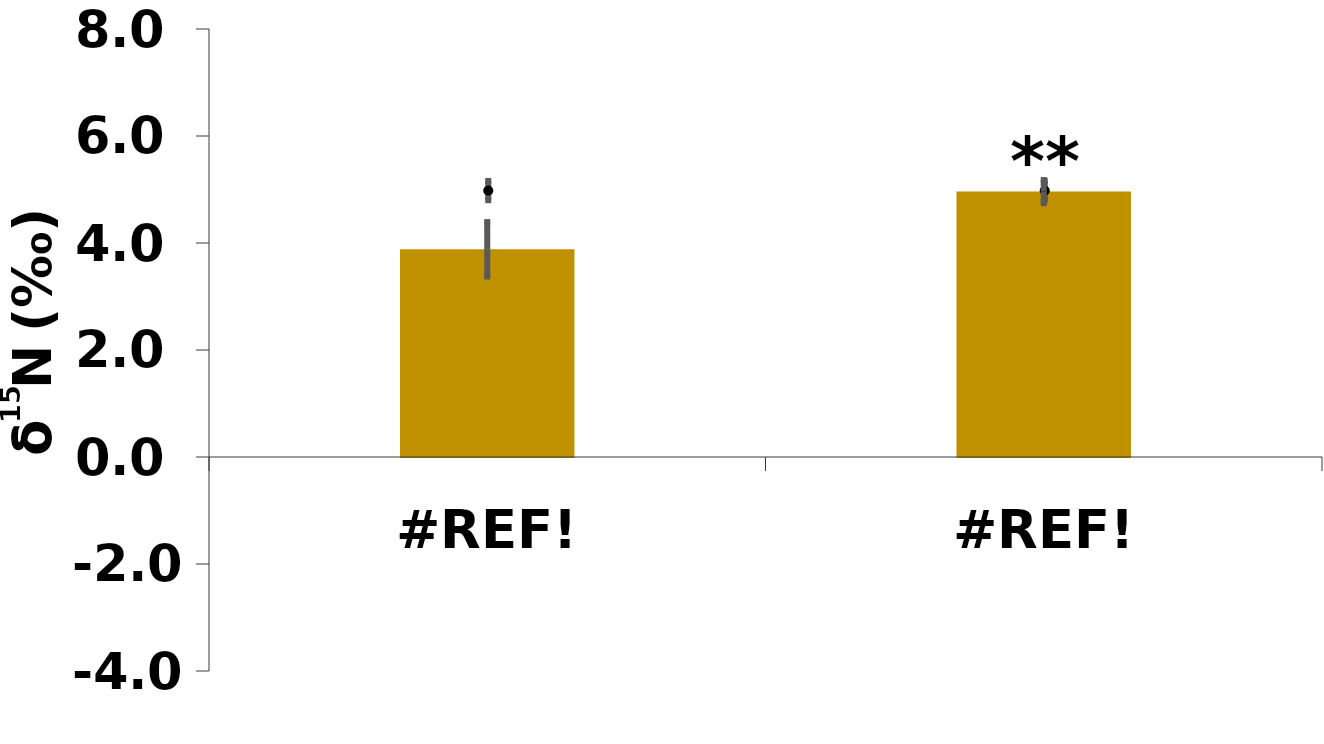
| Category | Whole plant |
|---|---|
| 0.0 | 3.882 |
| 0.0 | 4.961 |